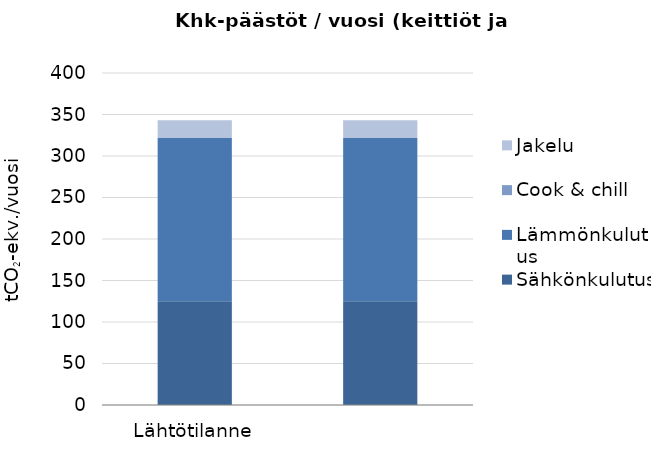
| Category | Sähkönkulutus | Lämmönkulutus | Cook & chill | Jakelu |
|---|---|---|---|---|
| Lähtötilanne | 125.137 | 196.52 | 0 | 21.308 |